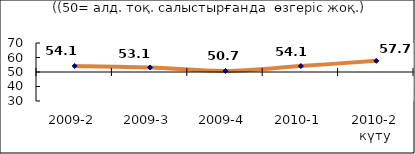
| Category | Диф.индекс ↓ |
|---|---|
| 2009-2 | 54.14 |
| 2009-3 | 53.125 |
| 2009-4 | 50.73 |
| 2010-1 | 54.12 |
| 2010-2 күту | 57.69 |